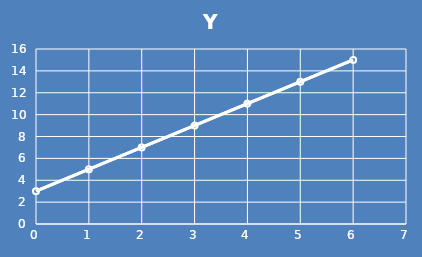
| Category | Y |
|---|---|
| 0.0 | 3 |
| 1.0 | 5 |
| 2.0 | 7 |
| 3.0 | 9 |
| 4.0 | 11 |
| 5.0 | 13 |
| 6.0 | 15 |